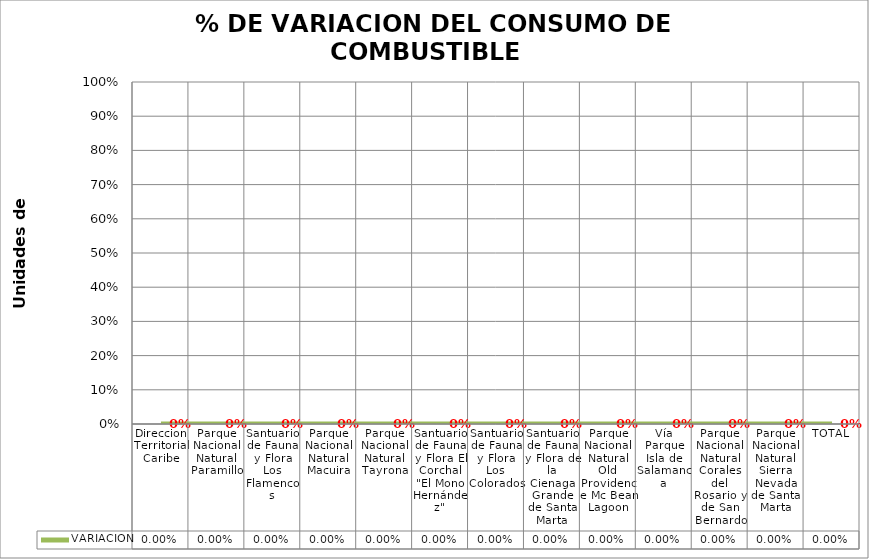
| Category | VARIACION |
|---|---|
| Direccion Territorial Caribe | 0 |
| Parque Nacional Natural Paramillo | 0 |
| Santuario de Fauna y Flora Los Flamencos | 0 |
| Parque Nacional Natural Macuira | 0 |
| Parque Nacional Natural Tayrona | 0 |
| Santuario de Fauna y Flora El Corchal "El Mono Hernández" | 0 |
| Santuario de Fauna y Flora Los Colorados | 0 |
| Santuario de Fauna y Flora de la Cienaga Grande de Santa Marta | 0 |
| Parque Nacional Natural Old Providence Mc Bean Lagoon | 0 |
| Vía Parque Isla de Salamanca | 0 |
| Parque Nacional Natural Corales del Rosario y de San Bernardo | 0 |
| Parque Nacional Natural Sierra Nevada de Santa Marta | 0 |
| TOTAL | 0 |